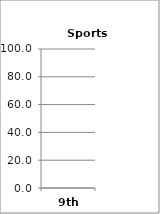
| Category | Sports (Choices) |
|---|---|
| 9th | 0 |